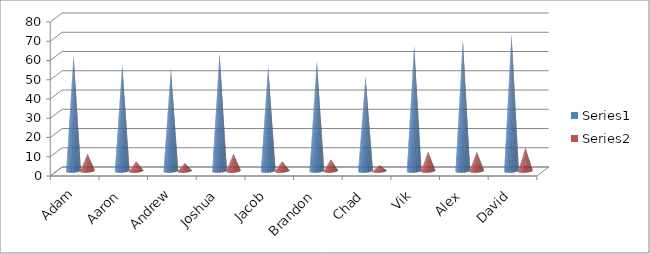
| Category | Series 0 | Series 1 |
|---|---|---|
| Adam | 60 | 9 |
| Aaron | 55 | 5 |
| Andrew | 53 | 4 |
| Joshua | 61 | 9 |
| Jacob | 54 | 5 |
| Brandon | 57 | 6 |
| Chad | 49 | 3 |
| Vik | 65 | 10 |
| Alex | 68 | 10 |
| David | 71 | 12 |